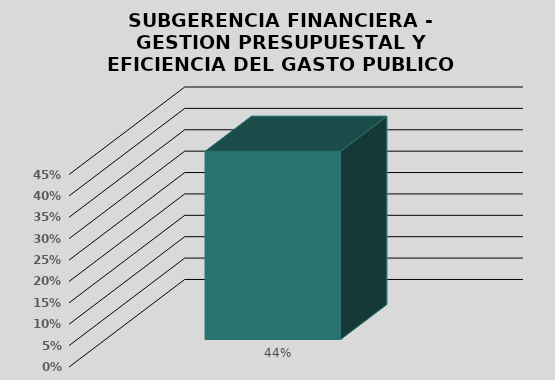
| Category | GESTION PRESUPUESTAL Y EFICIENCIA DEL GASTO PUBLICO |
|---|---|
| 0 | 0.44 |